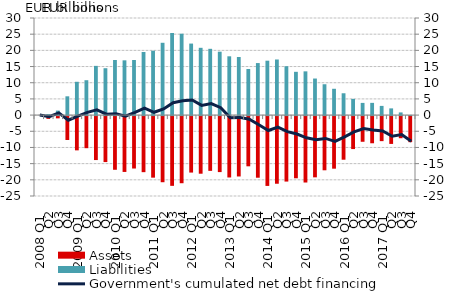
| Category | Assets | Liabilities |
|---|---|---|
| 2008 Q1 | 0 | 0 |
| Q2 | -0.851 | 0.337 |
| Q3 | -0.698 | 1.39 |
| Q4 | -7.383 | 5.802 |
| 2009 Q1 | -10.588 | 10.291 |
| Q2 | -9.918 | 10.776 |
| Q3 | -13.585 | 15.207 |
| Q4 | -14.207 | 14.485 |
| 2010 Q1 | -16.589 | 17.029 |
| Q2 | -17.255 | 16.921 |
| Q3 | -16.201 | 17.019 |
| Q4 | -17.327 | 19.493 |
| 2011 Q1 | -19.023 | 19.892 |
| Q2 | -20.434 | 22.342 |
| Q3 | -21.552 | 25.368 |
| Q4 | -20.744 | 25.148 |
| 2012 Q1 | -17.452 | 22.1 |
| Q2 | -17.803 | 20.791 |
| Q3 | -16.919 | 20.478 |
| Q4 | -17.305 | 19.594 |
| 2013 Q1 | -18.967 | 18.165 |
| Q2 | -18.657 | 17.945 |
| Q3 | -15.517 | 14.234 |
| Q4 | -19.044 | 16.078 |
| 2014 Q1 | -21.576 | 16.806 |
| Q2 | -20.902 | 17.179 |
| Q3 | -20.231 | 15.101 |
| Q4 | -19.214 | 13.372 |
| 2015 Q1 | -20.524 | 13.517 |
| Q2 | -18.928 | 11.298 |
| Q3 | -16.746 | 9.531 |
| Q4 | -16.249 | 8.129 |
| 2016 Q1 | -13.479 | 6.745 |
| Q2 | -10.189 | 5.006 |
| Q3 | -7.934 | 3.767 |
| Q4 | -8.398 | 3.778 |
| 2017 Q1 | -7.739 | 2.842 |
| Q2 | -8.601 | 2.073 |
| Q3 | -6.837 | 0.823 |
| Q4 | -8.057 | 0.002 |